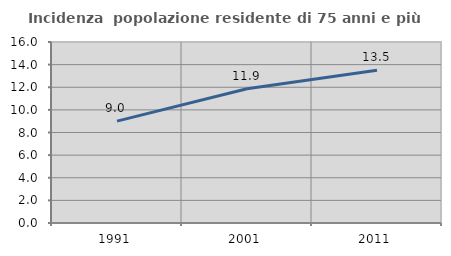
| Category | Incidenza  popolazione residente di 75 anni e più |
|---|---|
| 1991.0 | 9.005 |
| 2001.0 | 11.873 |
| 2011.0 | 13.494 |